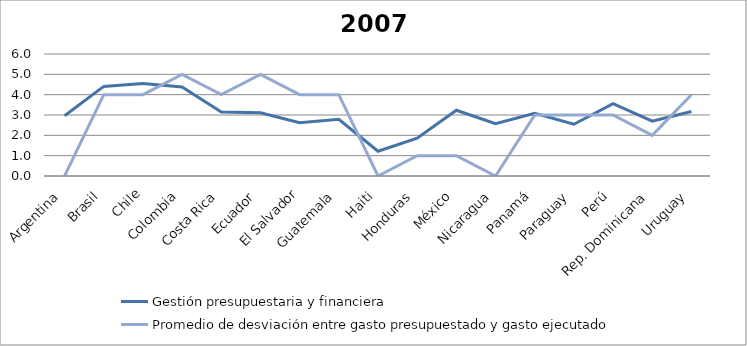
| Category | Gestión presupuestaria y financiera | Promedio de desviación entre gasto presupuestado y gasto ejecutado |
|---|---|---|
| Argentina | 2.96 | 0 |
| Brasil | 4.407 | 4 |
| Chile | 4.547 | 4 |
| Colombia | 4.373 | 5 |
| Costa Rica | 3.147 | 4 |
| Ecuador | 3.107 | 5 |
| El Salvador | 2.62 | 4 |
| Guatemala | 2.791 | 4 |
| Haiti | 1.22 | 0 |
| Honduras | 1.861 | 1 |
| México | 3.233 | 1 |
| Nicaragua | 2.568 | 0 |
| Panamá | 3.08 | 3 |
| Paraguay | 2.547 | 3 |
| Perú | 3.56 | 3 |
| Rep. Dominicana | 2.697 | 2 |
| Uruguay | 3.173 | 4 |